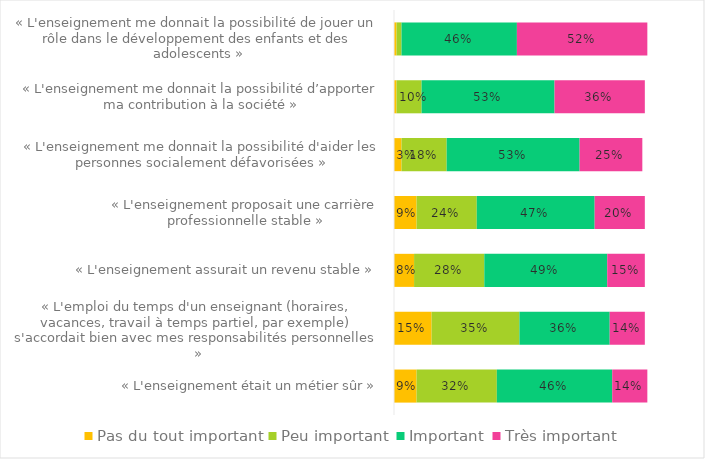
| Category | Pas du tout important | Peu important | Important | Très important |
|---|---|---|---|---|
| « L'enseignement était un métier sûr » | 0.09 | 0.32 | 0.46 | 0.14 |
| « L'emploi du temps d'un enseignant (horaires, vacances, travail à temps partiel, par exemple) s'accordait bien avec mes responsabilités personnelles » | 0.15 | 0.35 | 0.36 | 0.14 |
| « L'enseignement assurait un revenu stable » | 0.08 | 0.28 | 0.49 | 0.15 |
| « L'enseignement proposait une carrière professionnelle stable » | 0.09 | 0.24 | 0.47 | 0.2 |
| « L'enseignement me donnait la possibilité d'aider les personnes socialement défavorisées » | 0.03 | 0.18 | 0.53 | 0.25 |
| « L'enseignement me donnait la possibilité d’apporter ma contribution à la société » | 0.01 | 0.1 | 0.53 | 0.36 |
| « L'enseignement me donnait la possibilité de jouer un rôle dans le développement des enfants et des adolescents » | 0.01 | 0.02 | 0.46 | 0.52 |